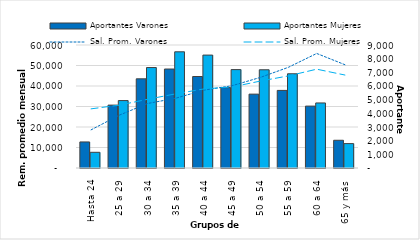
| Category | Aportantes Varones | Aportantes Mujeres |
|---|---|---|
| Hasta 24 | 1906 | 1148 |
| 25 a 29 | 4601 | 4934 |
| 30 a 34 | 6525 | 7351 |
| 35 a 39 | 7242 | 8502 |
| 40 a 44 | 6694 | 8262 |
| 45 a 49 | 5881 | 7200 |
| 50 a 54 | 5405 | 7187 |
| 55 a 59 | 5677 | 6895 |
| 60 a 64 | 4529 | 4759 |
| 65 y más | 2029 | 1785 |